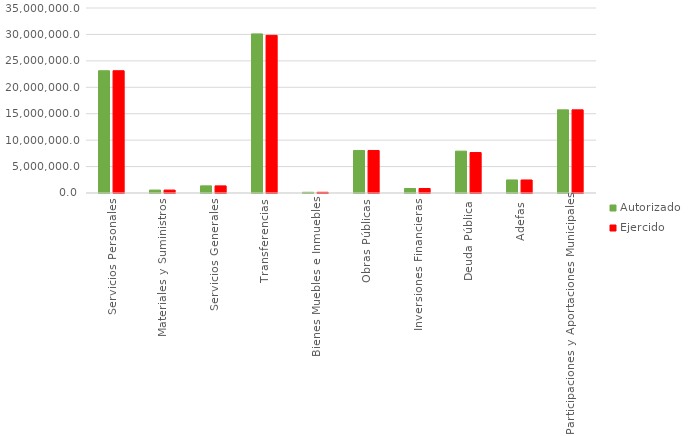
| Category | Autorizado | Ejercido |
|---|---|---|
| Servicios Personales | 23130854 | 23129288 |
| Materiales y Suministros | 555711.5 | 553422.4 |
| Servicios Generales | 1350726.3 | 1343340.2 |
| Transferencias | 30098880.2 | 29823279.3 |
| Bienes Muebles e Inmuebles | 131438 | 131139.9 |
| Obras Públicas | 8046019.1 | 8046019.1 |
| Inversiones Financieras | 850644.5 | 850644.5 |
| Deuda Pública | 7917637.6 | 7654261 |
| Adefas | 2467796 | 2462683.4 |
| Participaciones y Aportaciones Municipales | 15735057.5 | 15735057.5 |